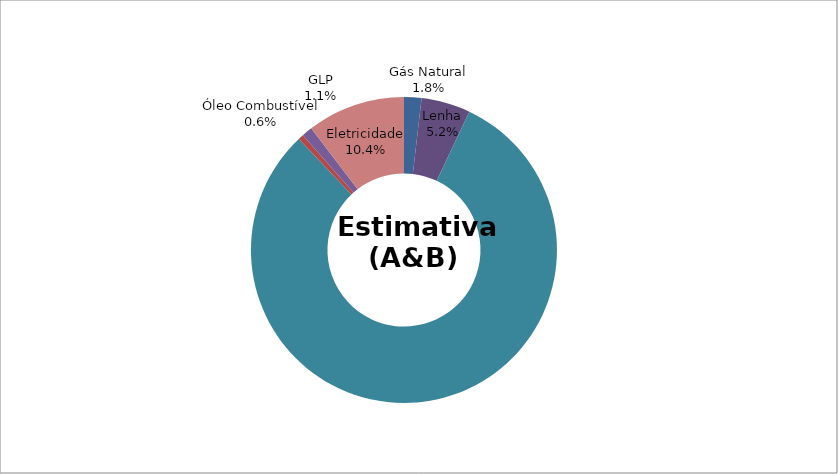
| Category | Series 0 |
|---|---|
| Gás Natural | 0.018 |
| Carvão Vapor | 0 |
| Carvão Metalúrgico | 0 |
| Lenha | 0.052 |
| Produtos da Cana | 0.809 |
| Outras Fontes Primárias | 0 |
| Óleo Diesel | 0 |
| Óleo Combustível | 0.006 |
| Gasolina | 0 |
| GLP | 0.011 |
| Querosene | 0 |
| Gases de Processo | 0 |
| Coque de Carvão Mineral | 0 |
| Eletricidade | 0.104 |
| Carvão vegetal | 0 |
| Álcool Etíllico | 0 |
| Outras Fontes Secundárias de Petróleo | 0 |
| Alcatrão | 0 |